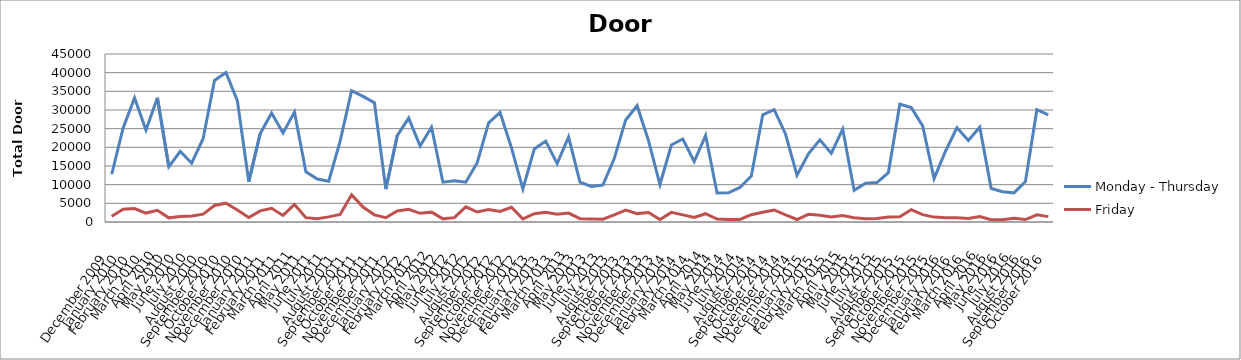
| Category | Monday - Thursday | Friday |
|---|---|---|
| December 2009 | 12794.08 | 1542.84 |
| January 2010 | 25183.6 | 3426.28 |
| February 2010 | 33229.04 | 3602.56 |
| March 2010 | 24653.2 | 2389.4 |
| April 2010 | 33251.4 | 3125.72 |
| May 2010 | 14776.84 | 1113.32 |
| June 2010 | 18934.76 | 1442.48 |
| July 2010 | 15737.28 | 1618.24 |
| August 2010 | 22301.24 | 2111.2 |
| September 2010 | 37928.28 | 4437.68 |
| October 2010 | 40062.36 | 5045.04 |
| November 2010 | 32506.76 | 3201.12 |
| December 2010 | 10798.84 | 1203.8 |
| January 2011 | 23665.72 | 2977 |
| February 2011 | 29174.08 | 3684.2 |
| March 2011 | 23840.96 | 1755 |
| April 2011 | 29448.64 | 4697.68 |
| May 2011 | 13457.6 | 1167.92 |
| June 2011 | 11518.52 | 848.64 |
| July 2011 | 10927.28 | 1373.32 |
| August 2011 | 21652.28 | 2016.04 |
| September 2011 | 35165 | 7283.64 |
| October 2011 | 33645.04 | 3995.16 |
| November 2011 | 31949.32 | 1914.64 |
| December 2011 | 8822.32 | 1140.88 |
| January 2012 | 23138.96 | 2971.8 |
| February 2012 | 27836.12 | 3397.16 |
| March 2012 | 20371 | 2331.68 |
| April 2012 | 25392.64 | 2635.36 |
| May 2012 | 10664.16 | 843.96 |
| June 2012 | 11031.8 | 1170 |
| July 2012 | 10674.56 | 4073.68 |
| August 2012 | 15888.6 | 2678 |
| September 2012 | 26550.16 | 3341.52 |
| October 2012 | 29338.4 | 2816.32 |
| November 2012 | 19865.04 | 3949.4 |
| December 2012 | 8835.32 | 809.64 |
| January 2013 | 19564.48 | 2219.36 |
| February 2013 | 21661.64 | 2578.16 |
| March 2013 | 15646.28 | 2096.12 |
| April 2013 | 22761.96 | 2379.52 |
| May 2013 | 10652.2 | 900.64 |
| June 2013 | 9501.96 | 809.64 |
| July 2013 | 9903.92 | 760.76 |
| August 2013 | 16986.32 | 1918.8 |
| September 2013 | 27335.36 | 3178.24 |
| October 2013 | 31147.48 | 2246.92 |
| November 2013 | 21774.48 | 2539.68 |
| December 2013 | 10033.92 | 693.16 |
| January 2014 | 20623.2 | 2579.72 |
| February 2014 | 22236.24 | 1914.12 |
| March 2014 | 16196.44 | 1202.76 |
| April 2014 | 23166 | 2222.48 |
| May 2014 | 7751.12 | 790.92 |
| June 2014 | 7806.76 | 637 |
| July 2014 | 9253.92 | 685.36 |
| August 2014 | 12338.04 | 1957.8 |
| September 2014 | 28718.04 | 2617.68 |
| October 2014 | 30092.4 | 3226.08 |
| November 2014 | 23509.2 | 1879.28 |
| December 2014 | 12504.96 | 670.28 |
| January 2015 | 18267.6 | 2067 |
| February 2015 | 22011.6 | 1830.92 |
| March 2015 | 18389.8 | 1341.6 |
| April 2015 | 24897.08 | 1712.36 |
| May 2015 | 8502.52 | 1155.44 |
| June 2015 | 10416.12 | 886.08 |
| July 2015 | 10548.72 | 910.52 |
| August 2015 | 13220.48 | 1315.6 |
| September 2015 | 31540.6 | 1392.04 |
| October 2015 | 30675.84 | 3309.8 |
| November 2015 | 25745.72 | 1970.28 |
| December 2015 | 11624.6 | 1312.48 |
| January 2016 | 18957.64 | 1127.36 |
| February 2016 | 25289.68 | 1161.68 |
| March 2016 | 21823.36 | 911.56 |
| April 2016 | 25403.04 | 1485.64 |
| May 2016 | 8957.52 | 633.88 |
| June 2016 | 8103.16 | 632.32 |
| July 2016 | 7809.36 | 998.92 |
| August 2016 | 10832.64 | 660.4 |
| September 2016 | 30075.24 | 1942.72 |
| October 2016 | 28719.08 | 1438.32 |